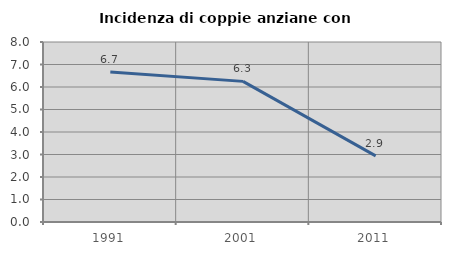
| Category | Incidenza di coppie anziane con figli |
|---|---|
| 1991.0 | 6.667 |
| 2001.0 | 6.25 |
| 2011.0 | 2.941 |